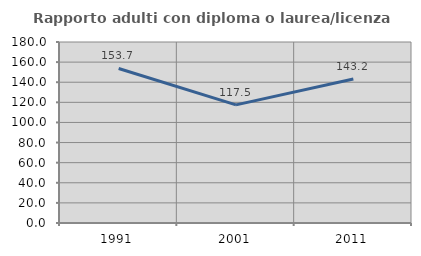
| Category | Rapporto adulti con diploma o laurea/licenza media  |
|---|---|
| 1991.0 | 153.704 |
| 2001.0 | 117.5 |
| 2011.0 | 143.243 |